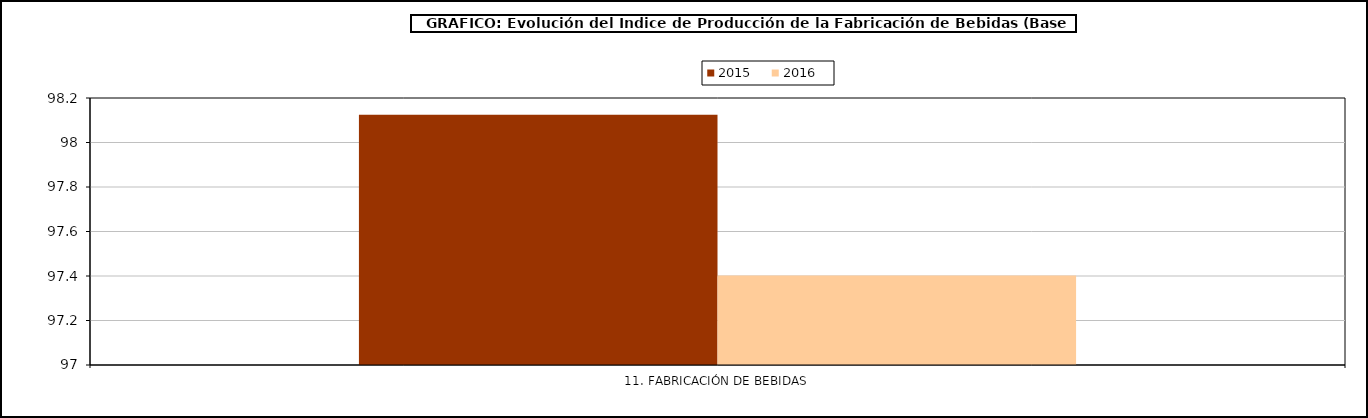
| Category | 2015 | 2016 |
|---|---|---|
| 11. FABRICACIÓN DE BEBIDAS | 98.125 | 97.403 |